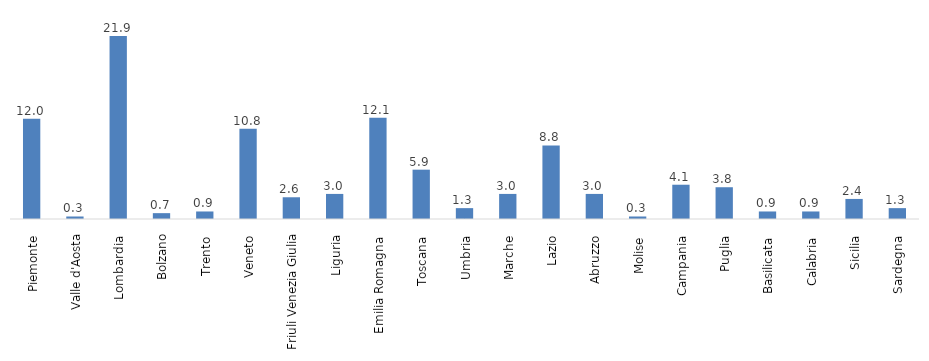
| Category | Series 0 |
|---|---|
| Piemonte  | 12 |
| Valle d'Aosta | 0.3 |
| Lombardia  | 21.9 |
| Bolzano | 0.7 |
| Trento  | 0.9 |
| Veneto  | 10.8 |
| Friuli Venezia Giulia | 2.6 |
| Liguria  | 3 |
| Emilia Romagna  | 12.1 |
| Toscana  | 5.9 |
| Umbria  | 1.3 |
| Marche  | 3 |
| Lazio  | 8.8 |
| Abruzzo  | 3 |
| Molise  | 0.3 |
| Campania  | 4.1 |
| Puglia  | 3.8 |
| Basilicata  | 0.9 |
| Calabria  | 0.9 |
| Sicilia  | 2.4 |
| Sardegna  | 1.3 |